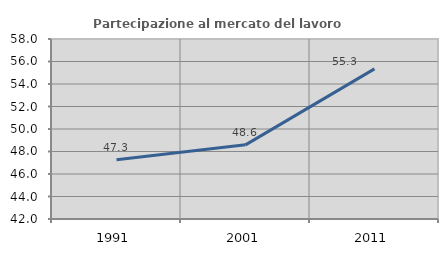
| Category | Partecipazione al mercato del lavoro  femminile |
|---|---|
| 1991.0 | 47.26 |
| 2001.0 | 48.592 |
| 2011.0 | 55.346 |